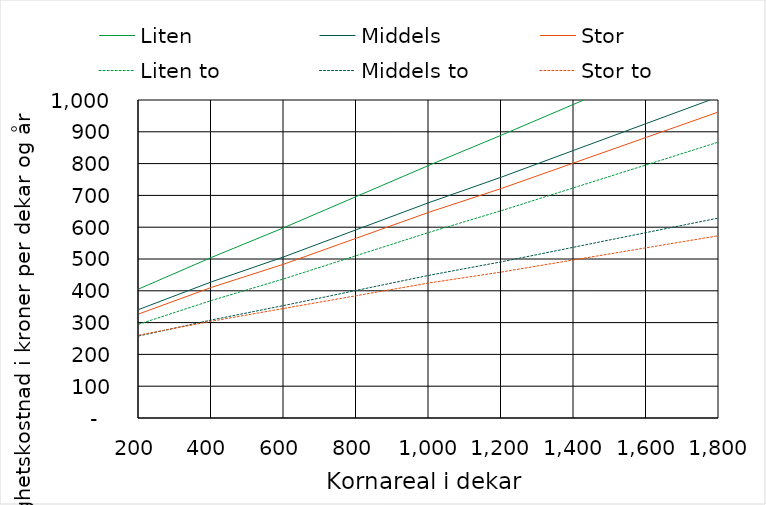
| Category | Liten | Middels | Stor | Liten to | Middels to | Stor to |
|---|---|---|---|---|---|---|
| 200.0 | 406.1 | 341.447 | 327.339 | 295.102 | 258.099 | 260.678 |
| 400.0 | 505.022 | 428.193 | 410.844 | 369.63 | 308.276 | 304.371 |
| 600.0 | 598.708 | 506.964 | 484.026 | 437.724 | 353.835 | 344.605 |
| 800.0 | 696.752 | 592.256 | 565.601 | 510.737 | 401.345 | 384.681 |
| 1000.0 | 794.674 | 677.427 | 647.056 | 583.628 | 448.734 | 424.636 |
| 1200.0 | 889.516 | 757.6 | 721.864 | 652.167 | 491.172 | 459.059 |
| 1400.0 | 986.926 | 842.009 | 802.342 | 724.278 | 537.279 | 497.305 |
| 1600.0 | 1084.216 | 926.297 | 882.7 | 796.267 | 583.264 | 535.43 |
| 1800.0 | 1181.385 | 1010.464 | 962.937 | 868.135 | 629.128 | 573.434 |